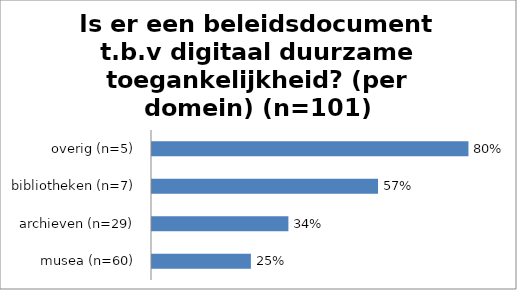
| Category | Series 0 |
|---|---|
| musea (n=60) | 0.25 |
| archieven (n=29) | 0.345 |
| bibliotheken (n=7) | 0.571 |
| overig (n=5) | 0.8 |